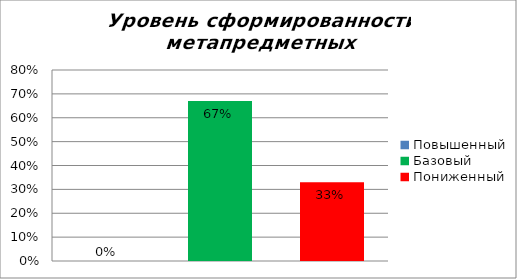
| Category | Уровень сформированности метапредметных результатов |
|---|---|
| Повышенный | 0 |
| Базовый | 0.67 |
| Пониженный | 0.33 |